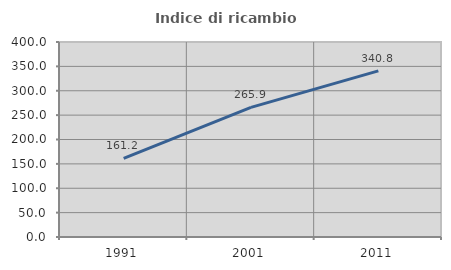
| Category | Indice di ricambio occupazionale  |
|---|---|
| 1991.0 | 161.24 |
| 2001.0 | 265.882 |
| 2011.0 | 340.845 |